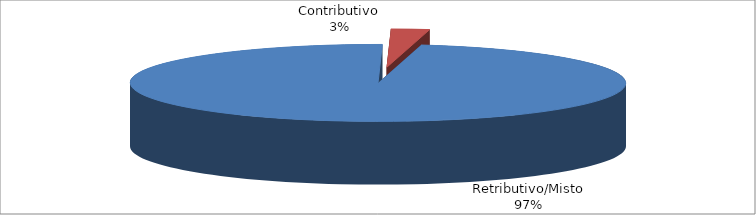
| Category | Decorrenti gennaio - marzo 2023 |
|---|---|
| Retributivo/Misto | 20652 |
| Contributivo | 530 |